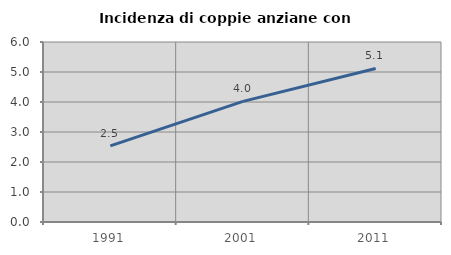
| Category | Incidenza di coppie anziane con figli |
|---|---|
| 1991.0 | 2.536 |
| 2001.0 | 4.021 |
| 2011.0 | 5.119 |